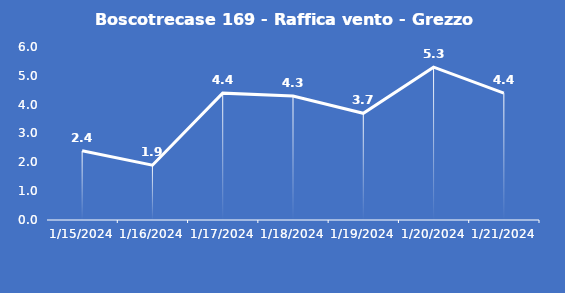
| Category | Boscotrecase 169 - Raffica vento - Grezzo (m/s) |
|---|---|
| 1/15/24 | 2.4 |
| 1/16/24 | 1.9 |
| 1/17/24 | 4.4 |
| 1/18/24 | 4.3 |
| 1/19/24 | 3.7 |
| 1/20/24 | 5.3 |
| 1/21/24 | 4.4 |